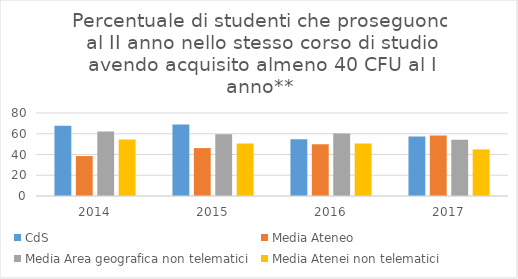
| Category | CdS | Media Ateneo | Media Area geografica non telematici | Media Atenei non telematici |
|---|---|---|---|---|
| 2014.0 | 67.7 | 38.5 | 62.1 | 54.4 |
| 2015.0 | 68.9 | 46.2 | 59.6 | 50.5 |
| 2016.0 | 54.6 | 50 | 60.2 | 50.6 |
| 2017.0 | 57.4 | 58.3 | 54.3 | 44.9 |